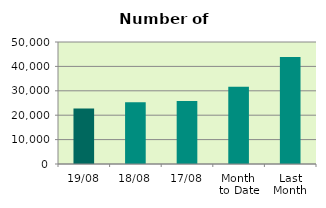
| Category | Series 0 |
|---|---|
| 19/08 | 22796 |
| 18/08 | 25284 |
| 17/08 | 25774 |
| Month 
to Date | 31632.615 |
| Last
Month | 43867.217 |